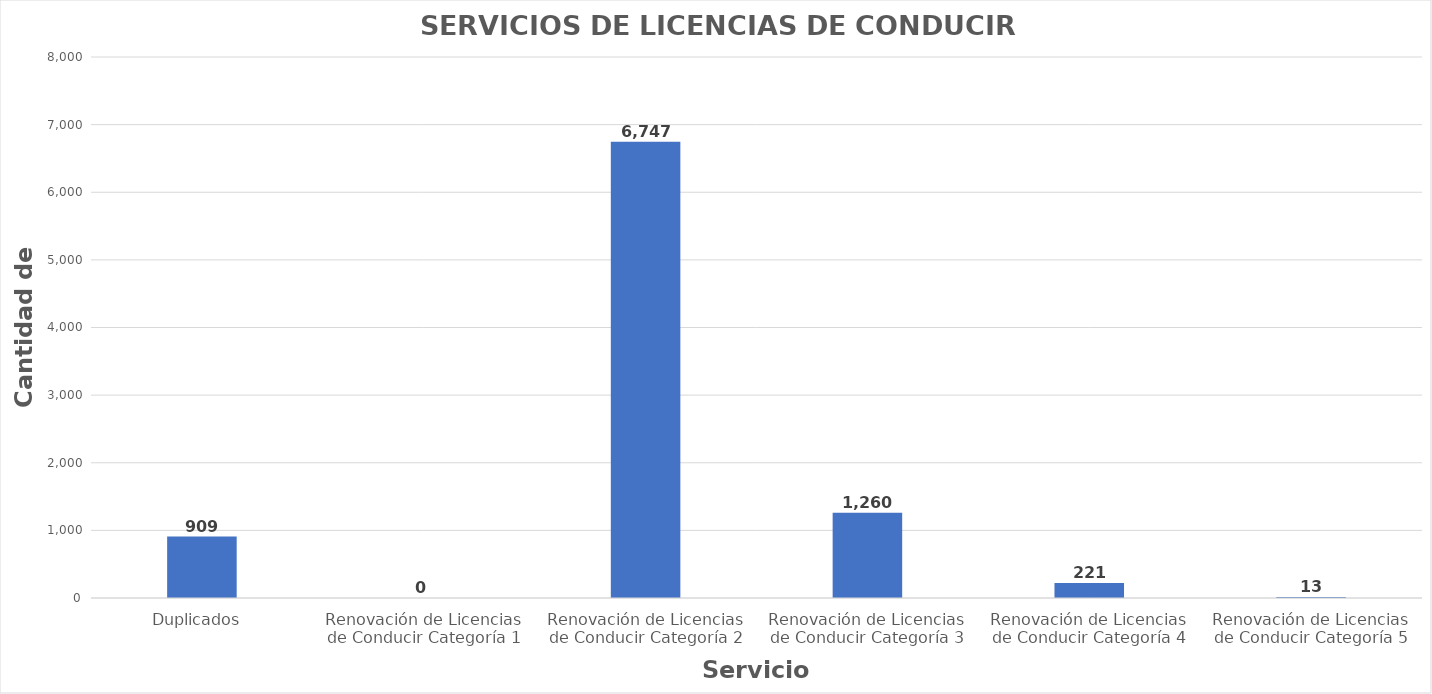
| Category | Series 0 |
|---|---|
| Duplicados  | 909 |
| Renovación de Licencias de Conducir Categoría 1 | 0 |
| Renovación de Licencias de Conducir Categoría 2 | 6747 |
| Renovación de Licencias de Conducir Categoría 3 | 1260 |
| Renovación de Licencias de Conducir Categoría 4 | 221 |
| Renovación de Licencias de Conducir Categoría 5 | 13 |